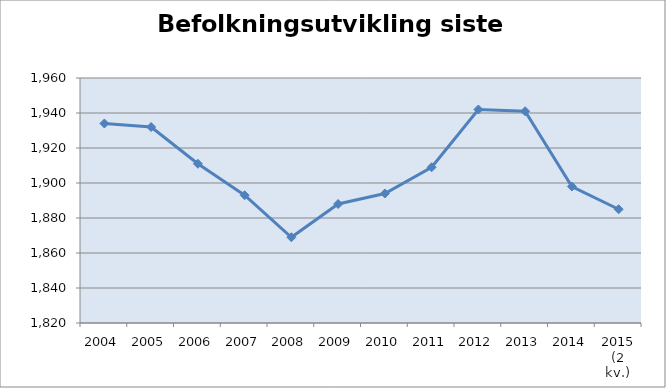
| Category | Series 0 |
|---|---|
| 2004 | 1934 |
| 2005 | 1932 |
| 2006 | 1911 |
| 2007 | 1893 |
| 2008 | 1869 |
| 2009 | 1888 |
| 2010 | 1894 |
| 2011 | 1909 |
| 2012 | 1942 |
| 2013 | 1941 |
| 2014 | 1898 |
| 2015 (2 kv.) | 1885 |